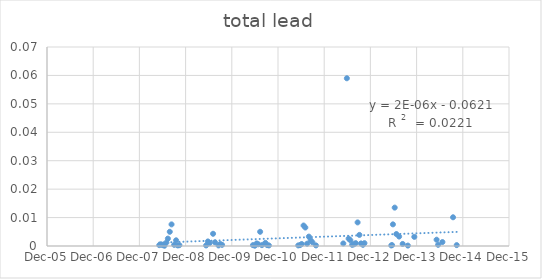
| Category | Series 0 |
|---|---|
| 39577.0 | 0 |
| 39590.0 | 0.001 |
| 39604.0 | 0 |
| 39618.0 | 0 |
| 39633.0 | 0.001 |
| 39645.0 | 0.003 |
| 39660.0 | 0.005 |
| 39674.0 | 0.008 |
| 39695.0 | 0 |
| 39710.0 | 0.002 |
| 39723.0 | 0 |
| 39736.0 | 0 |
| 39947.0 | 0 |
| 39961.0 | 0.002 |
| 39974.0 | 0.001 |
| 40002.0 | 0.004 |
| 40017.0 | 0.001 |
| 40045.0 | 0 |
| 40059.0 | 0.001 |
| 40073.0 | 0 |
| 40317.0 | 0 |
| 40332.0 | 0 |
| 40346.0 | 0.001 |
| 40359.0 | 0.001 |
| 40374.0 | 0.005 |
| 40388.0 | 0 |
| 40415.0 | 0.001 |
| 40429.0 | 0 |
| 40443.0 | 0 |
| 40675.0 | 0 |
| 40689.0 | 0 |
| 40702.0 | 0.001 |
| 40717.0 | 0.007 |
| 40731.0 | 0.006 |
| 40745.0 | 0.001 |
| 40759.0 | 0.003 |
| 40773.0 | 0.002 |
| 40787.0 | 0.001 |
| 40815.0 | 0 |
| 41031.0 | 0.001 |
| 41059.0 | 0.059 |
| 41073.0 | 0.003 |
| 41087.0 | 0.002 |
| 41101.0 | 0 |
| 41115.0 | 0.001 |
| 41129.0 | 0.001 |
| 41144.0 | 0.008 |
| 41158.0 | 0.004 |
| 41171.0 | 0.001 |
| 41186.0 | 0 |
| 41198.0 | 0.001 |
| 41410.0 | 0 |
| 41416.0 | 0 |
| 41423.0 | 0.008 |
| 41437.0 | 0.014 |
| 41450.0 | 0.004 |
| 41472.0 | 0.003 |
| 41500.0 | 0.001 |
| 41541.0 | 0 |
| 41592.0 | 0.003 |
| 41768.0 | 0.002 |
| 41780.0 | 0 |
| 41814.0 | 0.001 |
| 41898.0 | 0.01 |
| 41927.0 | 0 |